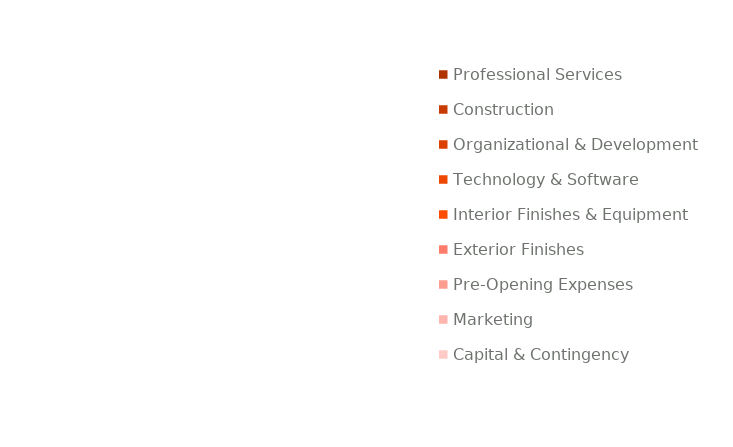
| Category | Series 0 | Series 1 | Series 2 |
|---|---|---|---|
| Professional Services |  |  | 60000 |
| Construction |  |  | 380000 |
| Organizational & Development |  |  | 185000 |
| Technology & Software |  |  | 31250 |
| Interior Finishes & Equipment |  |  | 438500 |
| Exterior Finishes |  |  | 60000 |
| Pre-Opening Expenses |  |  | 95000 |
| Marketing |  |  | 35000 |
| Capital & Contingency |  |  | 275000 |